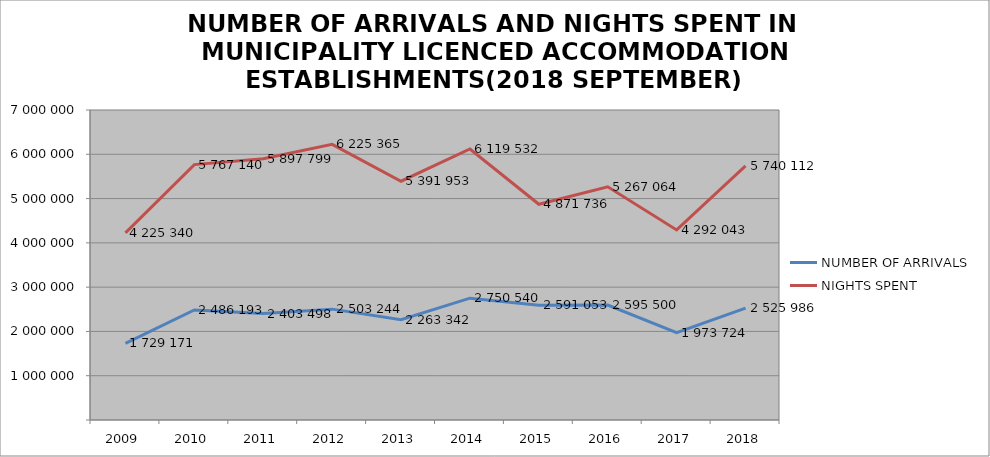
| Category | NUMBER OF ARRIVALS | NIGHTS SPENT |
|---|---|---|
| 2009 | 1729171 | 4225340 |
| 2010 | 2486193 | 5767140 |
| 2011 | 2403498 | 5897799 |
| 2012 | 2503244 | 6225365 |
| 2013 | 2263342 | 5391953 |
| 2014 | 2750540 | 6119532 |
| 2015 | 2591053 | 4871736 |
| 2016 | 2595500 | 5267064 |
| 2017 | 1973724 | 4292043 |
| 2018 | 2525986 | 5740112 |